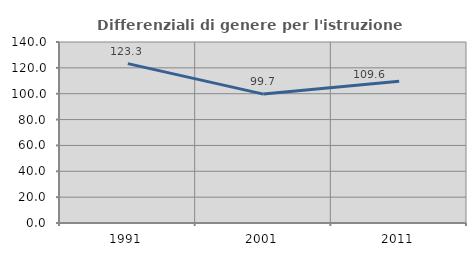
| Category | Differenziali di genere per l'istruzione superiore |
|---|---|
| 1991.0 | 123.269 |
| 2001.0 | 99.701 |
| 2011.0 | 109.598 |